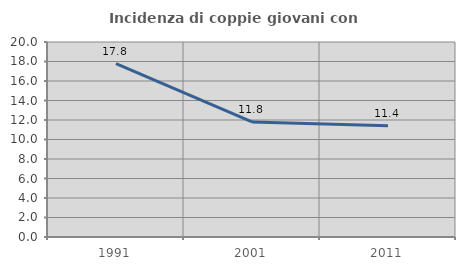
| Category | Incidenza di coppie giovani con figli |
|---|---|
| 1991.0 | 17.788 |
| 2001.0 | 11.797 |
| 2011.0 | 11.419 |